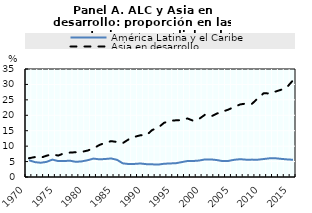
| Category | América Latina y el Caribe | Asia en desarrollo |
|---|---|---|
| 1970.0 | 5.439 | 6.083 |
| 1971.0 | 4.828 | 6.452 |
| 1972.0 | 4.619 | 6.222 |
| 1973.0 | 4.903 | 6.907 |
| 1974.0 | 5.639 | 7.326 |
| 1975.0 | 5.155 | 6.952 |
| 1976.0 | 5.178 | 7.694 |
| 1977.0 | 5.28 | 7.909 |
| 1978.0 | 4.909 | 8.026 |
| 1979.0 | 5.065 | 8.145 |
| 1980.0 | 5.439 | 8.572 |
| 1981.0 | 5.964 | 9.281 |
| 1982.0 | 5.724 | 10.367 |
| 1983.0 | 5.834 | 11.091 |
| 1984.0 | 6.008 | 11.623 |
| 1985.0 | 5.571 | 11.35 |
| 1986.0 | 4.421 | 10.997 |
| 1987.0 | 4.205 | 12.209 |
| 1988.0 | 4.242 | 13.014 |
| 1989.0 | 4.378 | 13.525 |
| 1990.0 | 4.166 | 13.506 |
| 1991.0 | 4.107 | 15.232 |
| 1992.0 | 4.019 | 15.947 |
| 1993.0 | 4.286 | 17.538 |
| 1994.0 | 4.392 | 18.197 |
| 1995.0 | 4.458 | 18.364 |
| 1996.0 | 4.809 | 18.424 |
| 1997.0 | 5.185 | 18.972 |
| 1998.0 | 5.185 | 18.213 |
| 1999.0 | 5.332 | 18.844 |
| 2000.0 | 5.703 | 20.188 |
| 2001.0 | 5.702 | 19.603 |
| 2002.0 | 5.494 | 20.547 |
| 2003.0 | 5.15 | 21.185 |
| 2004.0 | 5.217 | 21.861 |
| 2005.0 | 5.584 | 22.734 |
| 2006.0 | 5.77 | 23.523 |
| 2007.0 | 5.613 | 23.81 |
| 2008.0 | 5.632 | 23.716 |
| 2009.0 | 5.615 | 25.506 |
| 2010.0 | 5.827 | 27.152 |
| 2011.0 | 6.058 | 27.066 |
| 2012.0 | 6.071 | 27.685 |
| 2013.0 | 5.871 | 28.292 |
| 2014.0 | 5.696 | 29.193 |
| 2015.0 | 5.584 | 31.348 |